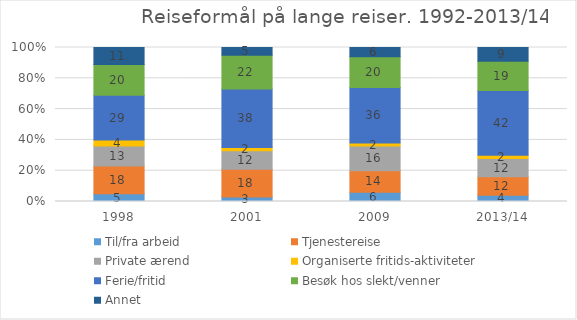
| Category | Til/fra arbeid | Tjenestereise | Private ærend | Organiserte fritids-aktiviteter | Ferie/fritid | Besøk hos slekt/venner | Annet |
|---|---|---|---|---|---|---|---|
| 1998 | 5 | 18 | 13 | 4 | 29 | 20 | 11 |
| 2001 | 3 | 18 | 12 | 2 | 38 | 22 | 5 |
| 2009 | 6 | 14 | 16 | 2 | 36 | 20 | 6 |
| 2013/14 | 4 | 12 | 12 | 2 | 42 | 19 | 9 |